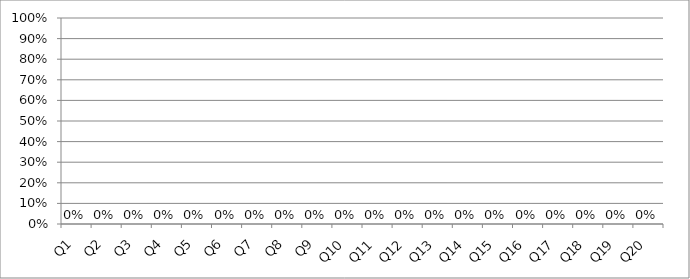
| Category | MATEMÁTICA |
|---|---|
| Q1 | 0 |
| Q2 | 0 |
| Q3 | 0 |
| Q4 | 0 |
| Q5 | 0 |
| Q6 | 0 |
| Q7 | 0 |
| Q8 | 0 |
| Q9 | 0 |
| Q10 | 0 |
| Q11 | 0 |
| Q12 | 0 |
| Q13 | 0 |
| Q14 | 0 |
| Q15 | 0 |
| Q16 | 0 |
| Q17 | 0 |
| Q18 | 0 |
| Q19 | 0 |
| Q20 | 0 |